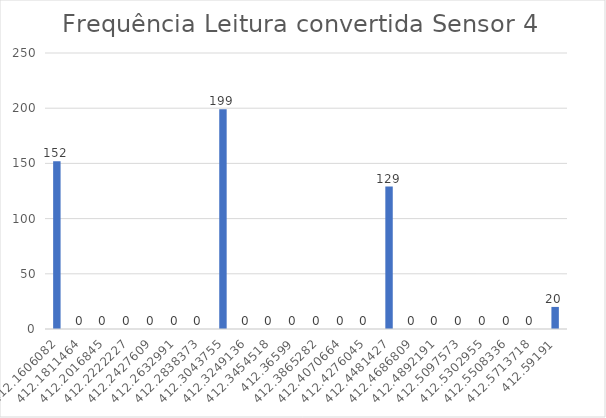
| Category | Series 0 |
|---|---|
| 412.16060818181813 | 152 |
| 412.18114636363634 | 0 |
| 412.20168454545455 | 0 |
| 412.2222227272727 | 0 |
| 412.24276090909086 | 0 |
| 412.2632990909091 | 0 |
| 412.2838372727273 | 0 |
| 412.30437545454544 | 199 |
| 412.3249136363636 | 0 |
| 412.3454518181818 | 0 |
| 412.36599 | 0 |
| 412.38652818181816 | 0 |
| 412.4070663636363 | 0 |
| 412.4276045454545 | 0 |
| 412.44814272727274 | 129 |
| 412.4686809090909 | 0 |
| 412.48921909090905 | 0 |
| 412.50975727272726 | 0 |
| 412.53029545454547 | 0 |
| 412.5508336363636 | 0 |
| 412.5713718181818 | 0 |
| 412.59191 | 20 |